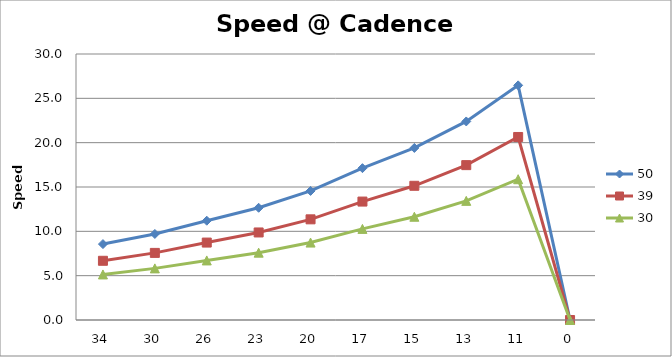
| Category | 50 | 39 | 30 |
|---|---|---|---|
| 34.0 | 8.562 | 6.678 | 5.137 |
| 30.0 | 9.703 | 7.569 | 5.822 |
| 26.0 | 11.196 | 8.733 | 6.718 |
| 23.0 | 12.657 | 9.872 | 7.594 |
| 20.0 | 14.555 | 11.353 | 8.733 |
| 17.0 | 17.124 | 13.356 | 10.274 |
| 15.0 | 19.407 | 15.137 | 11.644 |
| 13.0 | 22.392 | 17.466 | 13.435 |
| 11.0 | 26.464 | 20.642 | 15.878 |
| 0.0 | 0 | 0 | 0 |